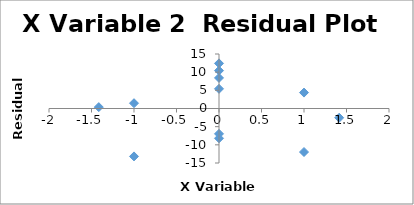
| Category | Series 0 |
|---|---|
| -1.0 | -13.188 |
| -1.0 | 1.454 |
| 1.0 | 4.379 |
| 1.0 | -11.979 |
| 0.0 | -8.19 |
| 0.0 | -6.976 |
| -1.414 | 0.379 |
| 1.414 | -2.545 |
| 0.0 | 5.417 |
| 0.0 | 8.417 |
| 0.0 | 12.417 |
| 0.0 | 10.417 |